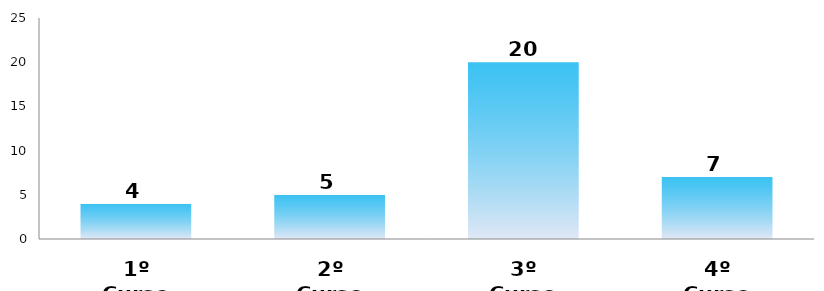
| Category | Series 0 |
|---|---|
| 1º Curso | 4 |
| 2º Curso | 5 |
| 3º Curso | 20 |
| 4º Curso | 7 |